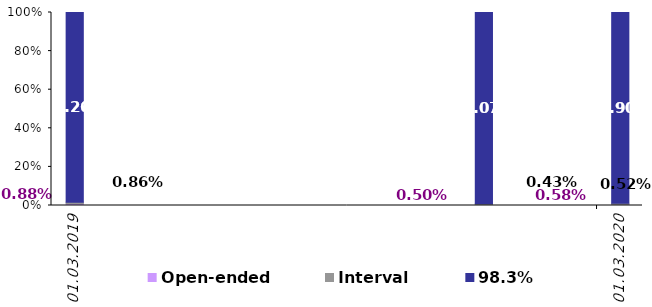
| Category | Open-ended | Interval | 98.3% |
|---|---|---|---|
| 2019-03-31 | 0.009 | 0.009 | 0.983 |
| 2019-12-31 | 0.005 | 0.004 | 0.991 |
| 2020-03-31 | 0.006 | 0.005 | 0.989 |